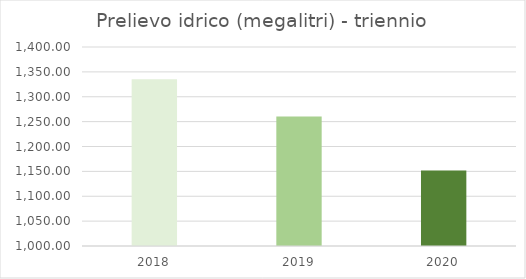
| Category | PRELIEVO IDRICO (megalitri) |
|---|---|
| 0 | 1335.27 |
| 1 | 1260.32 |
| 2 | 1151.81 |